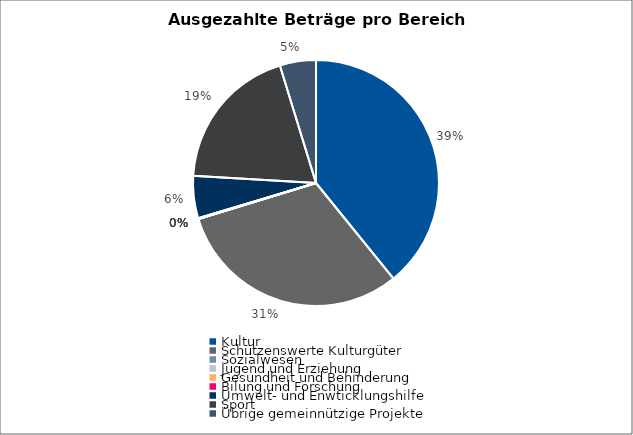
| Category | Series 0 |
|---|---|
| Kultur | 22176445 |
| Schützenswerte Kulturgüter | 17633569 |
| Sozialwesen | 0 |
| Jugend und Erziehung | 0 |
| Gesundheit und Behinderung | 0 |
| Bilung und Forschung | 52090 |
| Umwelt- und Enwticklungshilfe | 3144130 |
| Sport | 10944206 |
| Übrige gemeinnützige Projekte | 2691830 |